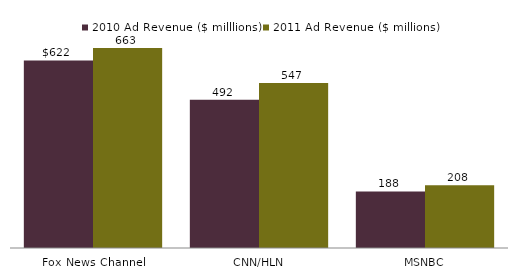
| Category | 2010 Ad Revenue ($ milllions) | 2011 Ad Revenue ($ millions) |
|---|---|---|
| Fox News Channel | 622.2 | 663.3 |
| CNN/HLN | 491.5 | 547.2 |
| MSNBC | 187.6 | 208.4 |